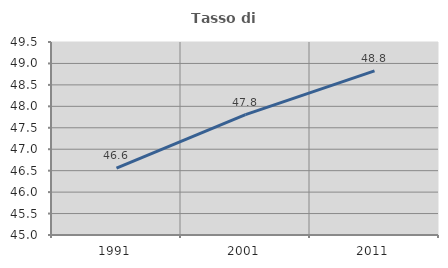
| Category | Tasso di occupazione   |
|---|---|
| 1991.0 | 46.56 |
| 2001.0 | 47.806 |
| 2011.0 | 48.828 |